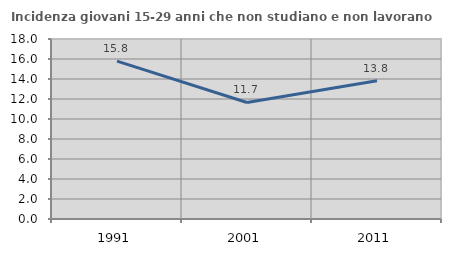
| Category | Incidenza giovani 15-29 anni che non studiano e non lavorano  |
|---|---|
| 1991.0 | 15.781 |
| 2001.0 | 11.654 |
| 2011.0 | 13.835 |